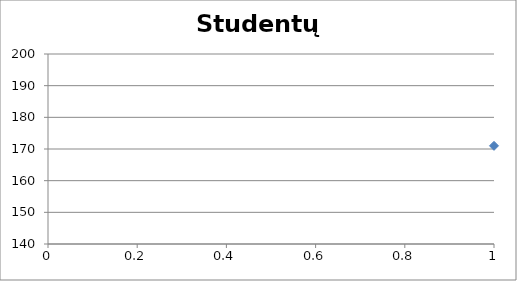
| Category | Studentų ūgiai |
|---|---|
| 0 | 171 |
| 1 | 168 |
| 2 | 162 |
| 3 | 161 |
| 4 | 161 |
| 5 | 174 |
| 6 | 160 |
| 7 | 185 |
| 8 | 182 |
| 9 | 174 |
| 10 | 169 |
| 11 | 170 |
| 12 | 170 |
| 13 | 172 |
| 14 | 166 |
| 15 | 168 |
| 16 | 165 |
| 17 | 163 |
| 18 | 177 |
| 19 | 176 |
| 20 | 172 |
| 21 | 172 |
| 22 | 165 |
| 23 | 169 |
| 24 | 173 |
| 25 | 172 |
| 26 | 171 |
| 27 | 167 |
| 28 | 183 |
| 29 | 165 |
| 30 | 167 |
| 31 | 160 |
| 32 | 169 |
| 33 | 180 |
| 34 | 181 |
| 35 | 179 |
| 36 | 186 |
| 37 | 189 |
| 38 | 180 |
| 39 | 195 |
| 40 | 187 |
| 41 | 179 |
| 42 | 169 |
| 43 | 171 |
| 44 | 174 |
| 45 | 161 |
| 46 | 187 |
| 47 | 187 |
| 48 | 179 |
| 49 | 185 |
| 50 | 171 |
| 51 | 157 |
| 52 | 186 |
| 53 | 165 |
| 54 | 173 |
| 55 | 177 |
| 56 | 170 |
| 57 | 168 |
| 58 | 169 |
| 59 | 171 |